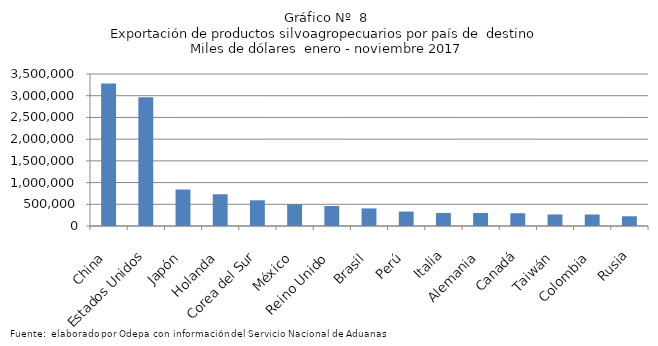
| Category | Series 0 |
|---|---|
| China | 3281040.614 |
| Estados Unidos | 2965553.729 |
| Japón | 840214.532 |
| Holanda | 730629.06 |
| Corea del Sur | 591684.999 |
| México | 499926.456 |
| Reino Unido | 459791.701 |
| Brasil | 405044.166 |
| Perú | 332013.471 |
| Italia | 300198.455 |
| Alemania | 299316.005 |
| Canadá | 293739.175 |
| Taiwán | 265636.5 |
| Colombia | 264660.145 |
| Rusia | 224311.457 |